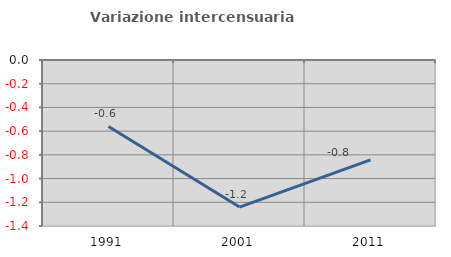
| Category | Variazione intercensuaria annua |
|---|---|
| 1991.0 | -0.56 |
| 2001.0 | -1.24 |
| 2011.0 | -0.843 |